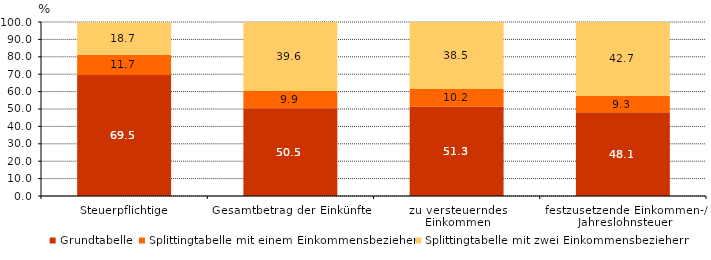
| Category | Grundtabelle | Splittingtabelle mit einem Einkommensbezieher | Splittingtabelle mit zwei Einkommensbeziehern |
|---|---|---|---|
| Steuerpflichtige | 69.5 | 11.7 | 18.7 |
| Gesamtbetrag der Einkünfte | 50.5 | 9.9 | 39.6 |
| zu versteuerndes 
Einkommen | 51.3 | 10.2 | 38.5 |
| festzusetzende Einkommen-/ Jahreslohnsteuer | 48.1 | 9.3 | 42.7 |